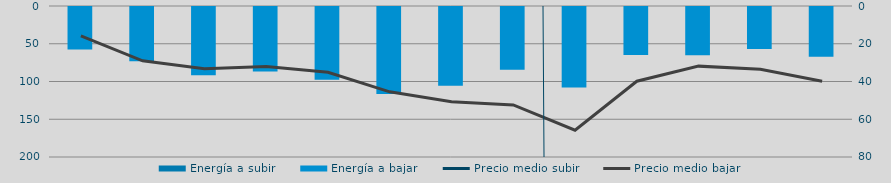
| Category | Energía a subir | Energía a bajar |
|---|---|---|
| D |  | 57735.941 |
| E |  | 73081.98 |
| F |  | 91860.526 |
| M |  | 86754.803 |
| A |  | 97600.018 |
| M |  | 116442.124 |
| J |  | 105775.107 |
| J |  | 84597.136 |
| A |  | 108041.453 |
| S |  | 65058.027 |
| O |  | 65080.662 |
| N |  | 56832.525 |
| D |  | 67245.511 |